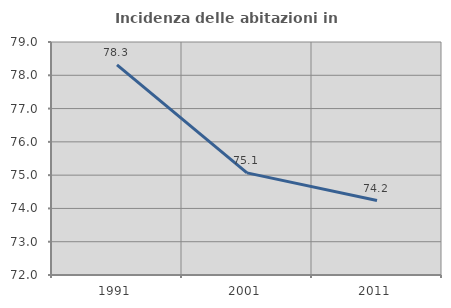
| Category | Incidenza delle abitazioni in proprietà  |
|---|---|
| 1991.0 | 78.315 |
| 2001.0 | 75.068 |
| 2011.0 | 74.237 |